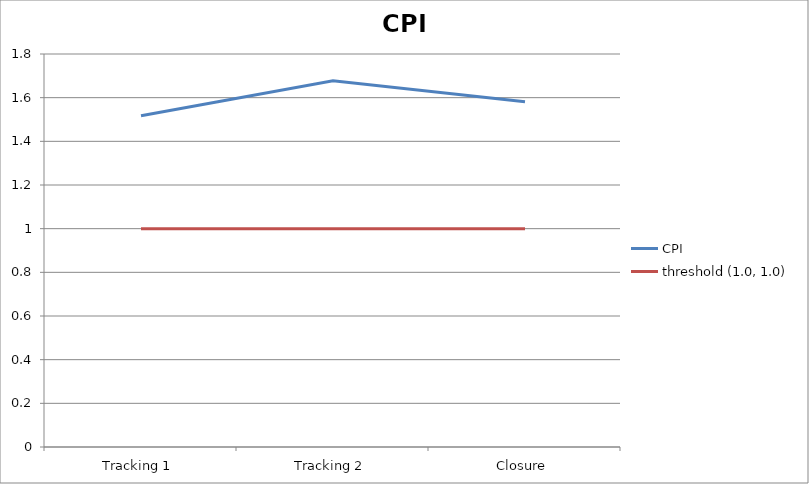
| Category | CPI | threshold (1.0, 1.0) |
|---|---|---|
| Tracking 1 | 1.517 | 1 |
| Tracking 2 | 1.678 | 1 |
| Closure | 1.582 | 1 |